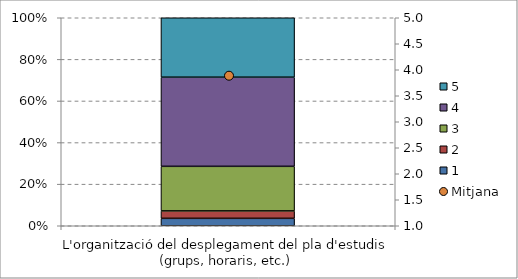
| Category | 1 | 2 | 3 | 4 | 5 |
|---|---|---|---|---|---|
| L'organització del desplegament del pla d'estudis (grups, horaris, etc.) | 0.036 | 0.036 | 0.214 | 0.429 | 0.286 |